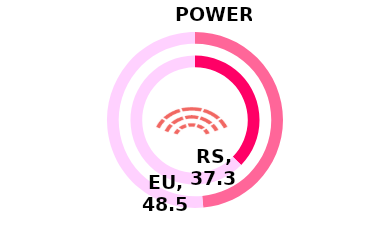
| Category | RS | Series 1 | EU |
|---|---|---|---|
| Index | 37.3 |  | 48.5 |
| Rest | 62.7 |  | 51.5 |